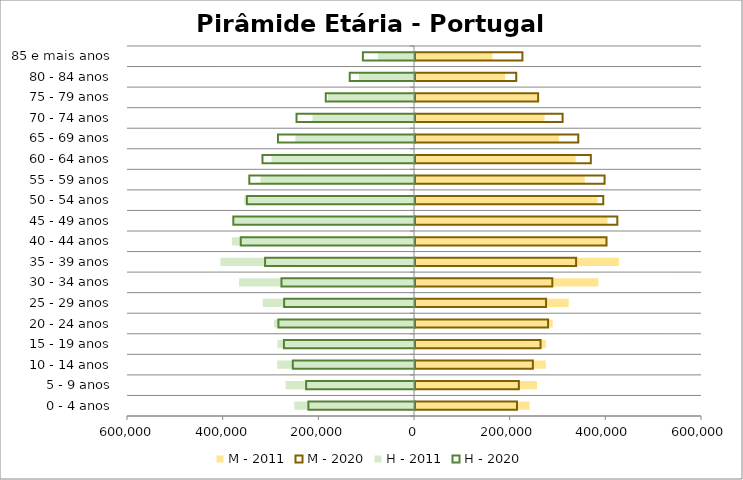
| Category | M - 2011 | M - 2020 | H - 2011 | H - 2020 |
|---|---|---|---|---|
| 0 - 4 anos | 239726 | 213195 | -250223 | -222839 |
| 5 - 9 anos | 255094 | 217124 | -268433 | -227582 |
| 10 - 14 anos | 273416 | 246396 | -286008 | -255492 |
| 15 - 19 anos | 273453 | 262453 | -285437 | -273988 |
| 20 - 24 anos | 288074 | 278201 | -292447 | -285592 |
| 25 - 29 anos | 321381 | 273972 | -316114 | -273621 |
| 30 - 34 anos | 383396 | 287071 | -365735 | -279181 |
| 35 - 39 anos | 426522 | 336793 | -404797 | -313432 |
| 40 - 44 anos | 399264 | 400397 | -380465 | -364276 |
| 45 - 49 anos | 402348 | 422968 | -376018 | -379850 |
| 50 - 54 anos | 381485 | 393571 | -354921 | -351450 |
| 55 - 59 anos | 354952 | 396324 | -321094 | -346405 |
| 60 - 64 anos | 335968 | 367558 | -297981 | -318873 |
| 65 - 69 anos | 300662 | 341353 | -248090 | -286488 |
| 70 - 74 anos | 271125 | 308579 | -212125 | -247693 |
| 75 - 79 anos | 255071 | 257377 | -179950 | -186568 |
| 80 - 84 anos | 188327 | 211629 | -115077 | -136439 |
| 85 e mais anos | 161697 | 224542 | -75522 | -108980 |